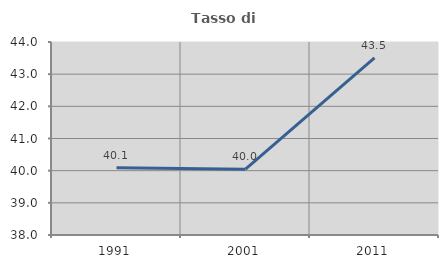
| Category | Tasso di occupazione   |
|---|---|
| 1991.0 | 40.091 |
| 2001.0 | 40.045 |
| 2011.0 | 43.508 |